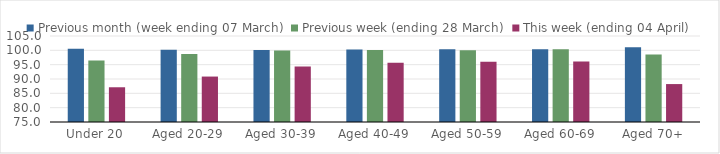
| Category | Previous month (week ending 07 March) | Previous week (ending 28 March) | This week (ending 04 April) |
|---|---|---|---|
| Under 20 | 100.541 | 96.427 | 87.117 |
| Aged 20-29 | 100.16 | 98.729 | 90.852 |
| Aged 30-39 | 100.139 | 99.96 | 94.347 |
| Aged 40-49 | 100.249 | 100.113 | 95.645 |
| Aged 50-59 | 100.385 | 100.07 | 96.046 |
| Aged 60-69 | 100.349 | 100.369 | 96.125 |
| Aged 70+ | 101.047 | 98.582 | 88.23 |